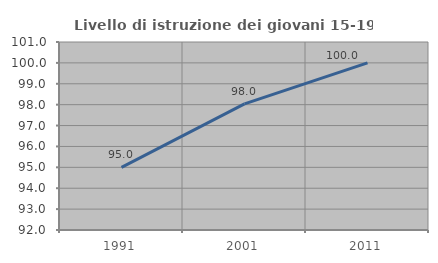
| Category | Livello di istruzione dei giovani 15-19 anni |
|---|---|
| 1991.0 | 95 |
| 2001.0 | 98.039 |
| 2011.0 | 100 |